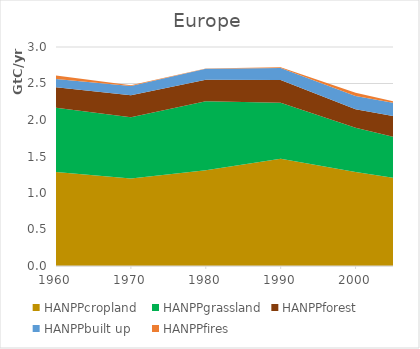
| Category | HANPPcropland | HANPPgrassland | HANPPforest | HANPPbuilt up | HANPPfires |
|---|---|---|---|---|---|
| 1960.0 | 1286588.605 | 880370.069 | 280224.293 | 112763.101 | 50178 |
| 1970.0 | 1198845.098 | 837335.785 | 302491.302 | 128615.588 | 9464 |
| 1980.0 | 1310295.144 | 948158.468 | 293087.126 | 151257.024 | 4108 |
| 1990.0 | 1470886.532 | 766777.019 | 309667.369 | 165745.486 | 10805.392 |
| 2000.0 | 1287285.277 | 606763.677 | 254100.341 | 181963.796 | 42785.392 |
| 2005.0 | 1208408.615 | 562260.324 | 283509.855 | 183012.362 | 21320 |